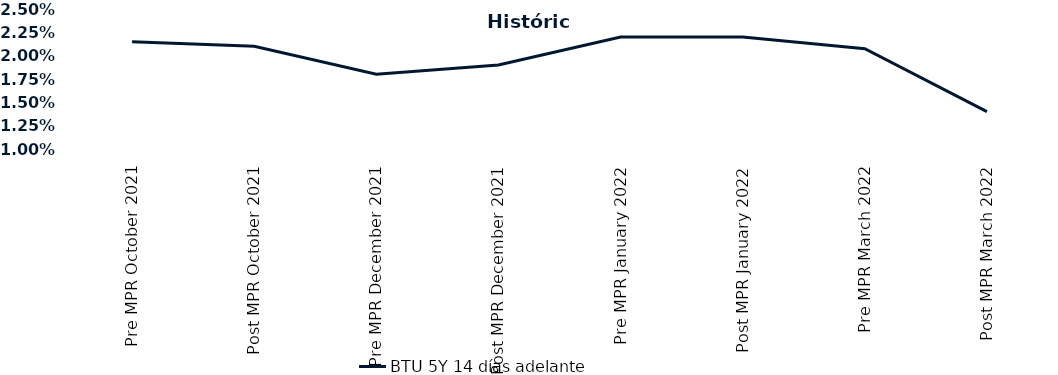
| Category | BTU 5Y 14 días adelante |
|---|---|
| Pre MPR October 2021 | 0.022 |
| Post MPR October 2021 | 0.021 |
| Pre MPR December 2021 | 0.018 |
| Post MPR December 2021 | 0.019 |
| Pre MPR January 2022 | 0.022 |
| Post MPR January 2022 | 0.022 |
| Pre MPR March 2022 | 0.021 |
| Post MPR March 2022 | 0.014 |